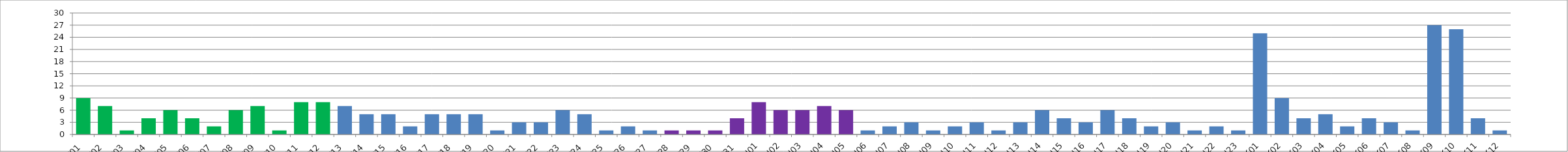
| Category | Series 0 |
|---|---|
| W01 | 9 |
| W02 | 7 |
| W03 | 1 |
| W04 | 4 |
| W05 | 6 |
| W06 | 4 |
| W07 | 2 |
| W08 | 6 |
| W09 | 7 |
| W10 | 1 |
| W11 | 8 |
| W12 | 8 |
| W13 | 7 |
| W14 | 5 |
| W15 | 5 |
| W16 | 2 |
| W17 | 5 |
| W18 | 5 |
| W19 | 5 |
| W20 | 1 |
| W21 | 3 |
| W22 | 3 |
| W23 | 6 |
| W24 | 5 |
| W25 | 1 |
| W26 | 2 |
| W27 | 1 |
| W28 | 1 |
| W29 | 1 |
| W30 | 1 |
| W31 | 4 |
| U01 | 8 |
| U02 | 6 |
| U03 | 6 |
| U04 | 7 |
| U05 | 6 |
| U06 | 1 |
| U07 | 2 |
| U08 | 3 |
| U09 | 1 |
| U10 | 2 |
| U11 | 3 |
| U12 | 1 |
| U13 | 3 |
| U14 | 6 |
| U15 | 4 |
| U16 | 3 |
| U17 | 6 |
| U18 | 4 |
| U19 | 2 |
| U20 | 3 |
| U21 | 1 |
| U22 | 2 |
| U23 | 1 |
| K01 | 25 |
| K02 | 9 |
| K03 | 4 |
| K04 | 5 |
| K05 | 2 |
| K06 | 4 |
| K07 | 3 |
| K08 | 1 |
| K09 | 27 |
| K10 | 26 |
| K11 | 4 |
| K12 | 1 |